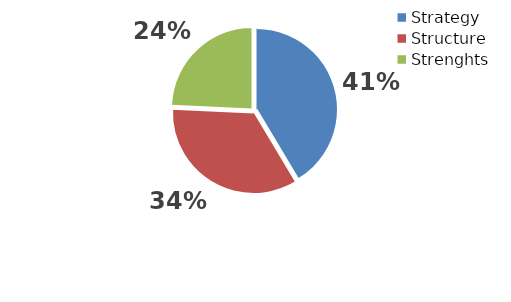
| Category | Series 0 |
|---|---|
| Strategy | 0.414 |
| Structure | 0.343 |
| Strenghts | 0.243 |